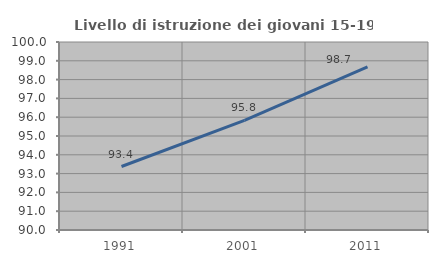
| Category | Livello di istruzione dei giovani 15-19 anni |
|---|---|
| 1991.0 | 93.377 |
| 2001.0 | 95.833 |
| 2011.0 | 98.674 |